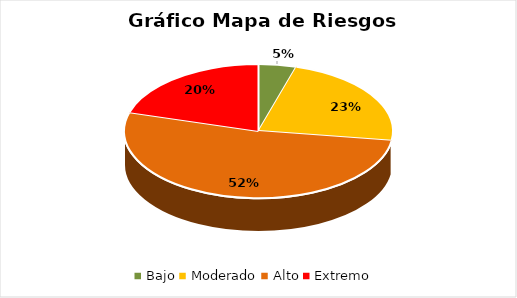
| Category | Series 0 |
|---|---|
| Bajo | 0.045 |
| Moderado | 0.227 |
| Alto | 0.523 |
| Extremo | 0.205 |